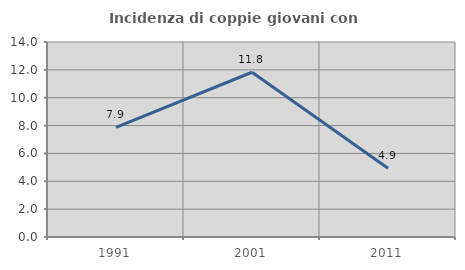
| Category | Incidenza di coppie giovani con figli |
|---|---|
| 1991.0 | 7.865 |
| 2001.0 | 11.828 |
| 2011.0 | 4.938 |